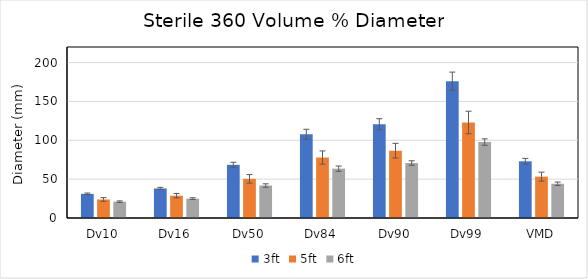
| Category | 3ft | 5ft | 6ft |
|---|---|---|---|
| Dv10 | 31.078 | 23.841 | 21.03 |
| Dv16 | 38.002 | 28.675 | 24.905 |
| Dv50 | 68.413 | 50.367 | 41.792 |
| Dv84 | 107.67 | 77.817 | 63.474 |
| Dv90 | 120.611 | 86.644 | 70.717 |
| Dv99 | 176.029 | 122.843 | 97.677 |
| VMD | 72.953 | 53.224 | 44.058 |